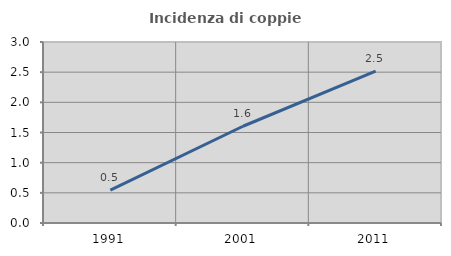
| Category | Incidenza di coppie miste |
|---|---|
| 1991.0 | 0.546 |
| 2001.0 | 1.603 |
| 2011.0 | 2.516 |